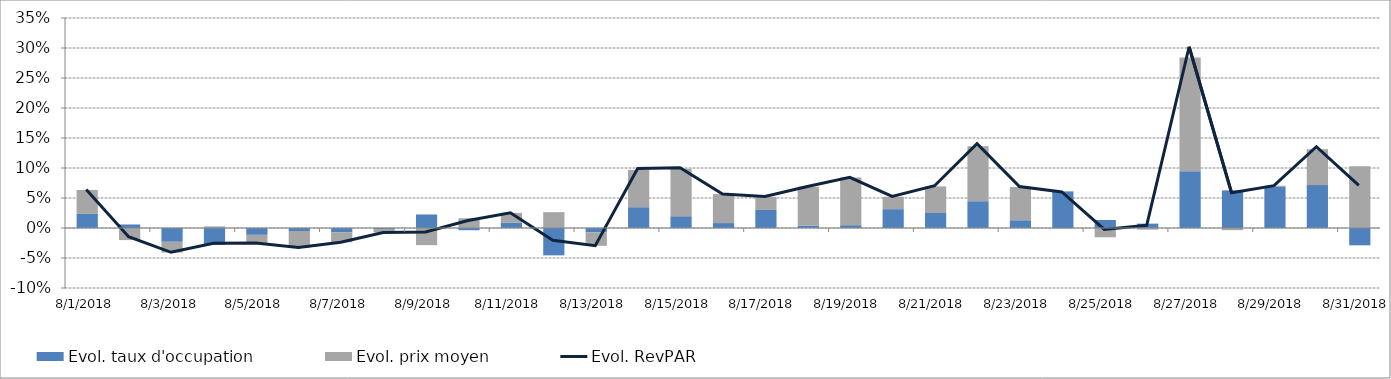
| Category | Evol. taux d'occupation | Evol. prix moyen |
|---|---|---|
| 8/1/18 | 0.023 | 0.04 |
| 8/2/18 | 0.006 | -0.02 |
| 8/3/18 | -0.023 | -0.018 |
| 8/4/18 | -0.028 | 0.003 |
| 8/5/18 | -0.011 | -0.014 |
| 8/6/18 | -0.005 | -0.028 |
| 8/7/18 | -0.007 | -0.016 |
| 8/8/18 | -0.002 | -0.006 |
| 8/9/18 | 0.023 | -0.029 |
| 8/10/18 | -0.004 | 0.016 |
| 8/11/18 | 0.009 | 0.016 |
| 8/12/18 | -0.046 | 0.026 |
| 8/13/18 | -0.007 | -0.022 |
| 8/14/18 | 0.035 | 0.062 |
| 8/15/18 | 0.02 | 0.079 |
| 8/16/18 | 0.008 | 0.048 |
| 8/17/18 | 0.03 | 0.022 |
| 8/18/18 | 0.004 | 0.065 |
| 8/19/18 | 0.005 | 0.079 |
| 8/20/18 | 0.031 | 0.021 |
| 8/21/18 | 0.025 | 0.044 |
| 8/22/18 | 0.045 | 0.092 |
| 8/23/18 | 0.013 | 0.055 |
| 8/24/18 | 0.061 | -0.001 |
| 8/25/18 | 0.013 | -0.015 |
| 8/26/18 | 0.007 | -0.003 |
| 8/27/18 | 0.094 | 0.19 |
| 8/28/18 | 0.063 | -0.004 |
| 8/29/18 | 0.069 | 0.001 |
| 8/30/18 | 0.071 | 0.06 |
| 8/31/18 | -0.029 | 0.103 |